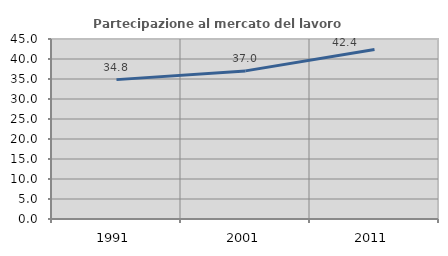
| Category | Partecipazione al mercato del lavoro  femminile |
|---|---|
| 1991.0 | 34.844 |
| 2001.0 | 37.027 |
| 2011.0 | 42.401 |